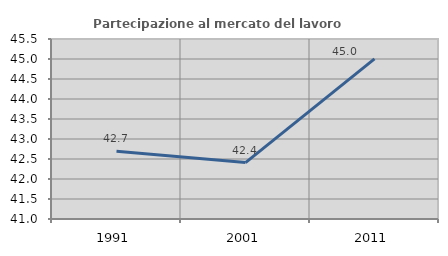
| Category | Partecipazione al mercato del lavoro  femminile |
|---|---|
| 1991.0 | 42.691 |
| 2001.0 | 42.411 |
| 2011.0 | 45.003 |